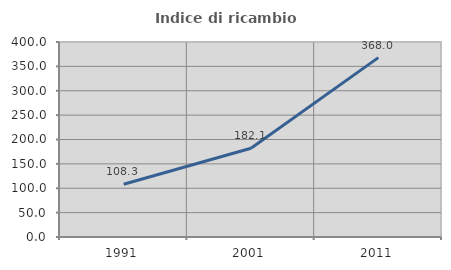
| Category | Indice di ricambio occupazionale  |
|---|---|
| 1991.0 | 108.273 |
| 2001.0 | 182.08 |
| 2011.0 | 367.988 |